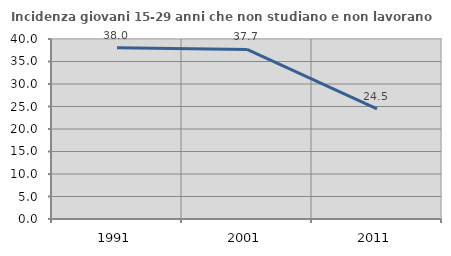
| Category | Incidenza giovani 15-29 anni che non studiano e non lavorano  |
|---|---|
| 1991.0 | 38.043 |
| 2001.0 | 37.691 |
| 2011.0 | 24.456 |